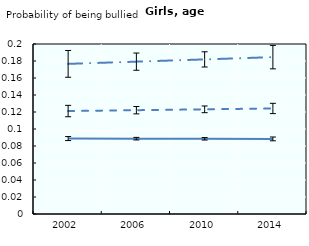
| Category | Healthy weight | Overweight | Obese |
|---|---|---|---|
| 2002.0 | 0.089 | 0.121 | 0.177 |
| 2006.0 | 0.089 | 0.122 | 0.179 |
| 2010.0 | 0.088 | 0.123 | 0.182 |
| 2014.0 | 0.088 | 0.124 | 0.185 |